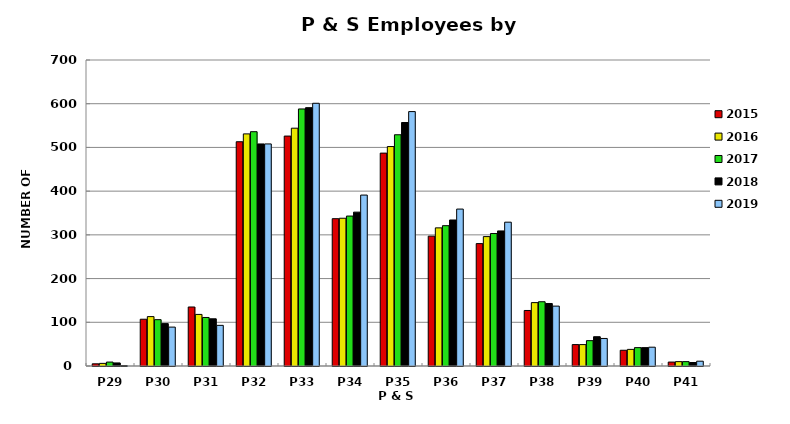
| Category | 2015 | 2016 | 2017 | 2018 | 2019 |
|---|---|---|---|---|---|
| P29 | 5 | 6 | 9 | 7 | 1 |
| P30 | 107 | 113 | 106 | 97 | 89 |
| P31 | 135 | 118 | 111 | 108 | 93 |
| P32 | 513 | 531 | 536 | 508 | 508 |
| P33 | 526 | 544 | 588 | 591 | 601 |
| P34 | 337 | 338 | 343 | 352 | 391 |
| P35 | 487 | 502 | 529 | 557 | 582 |
| P36 | 297 | 316 | 321 | 334 | 359 |
| P37 | 280 | 296 | 303 | 309 | 329 |
| P38 | 127 | 145 | 147 | 143 | 137 |
| P39 | 49 | 49 | 58 | 67 | 63 |
| P40 | 36 | 38 | 42 | 42 | 43 |
| P41 | 9 | 10 | 10 | 8 | 11 |